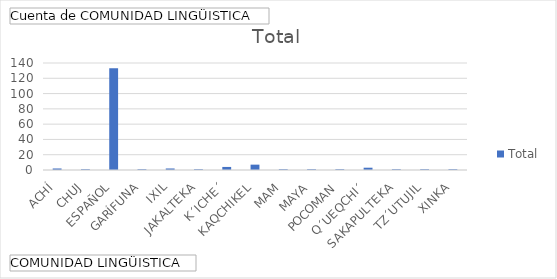
| Category | Total |
|---|---|
| ACHÍ | 2 |
| CHUJ | 1 |
| ESPAÑOL | 133 |
| GARÍFUNA | 1 |
| IXIL | 2 |
| JAKALTEKA | 1 |
| K´ICHE´ | 4 |
| KAQCHIKEL | 7 |
| MAM | 1 |
| MAYA | 1 |
| POCOMAN | 1 |
| Q´UEQCHI´ | 3 |
| SAKAPULTEKA | 1 |
| TZ´UTUJIL | 1 |
| XINKA | 1 |